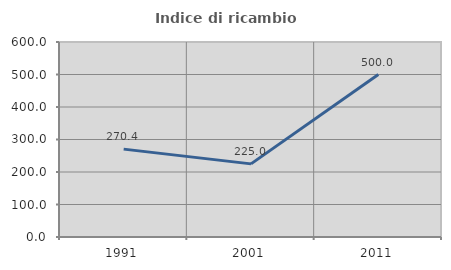
| Category | Indice di ricambio occupazionale  |
|---|---|
| 1991.0 | 270.37 |
| 2001.0 | 225 |
| 2011.0 | 500 |